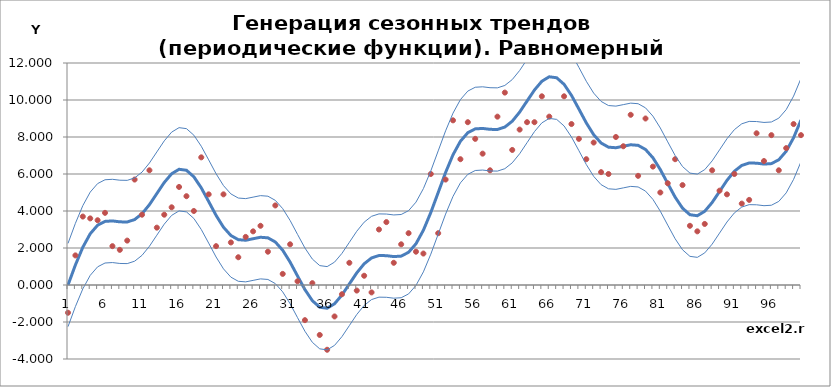
| Category | Тренд (Y) | С разбросом вокруг тренда (Y) | Нижняя граница | Верхняя граница |
|---|---|---|---|---|
| 0 | 0 | -1.5 | -2.25 | 2.25 |
| 1 | 1.083 | 1.6 | -1.167 | 3.333 |
| 2 | 2.039 | 3.7 | -0.211 | 4.289 |
| 3 | 2.771 | 3.6 | 0.521 | 5.021 |
| 4 | 3.232 | 3.5 | 0.982 | 5.482 |
| 5 | 3.439 | 3.9 | 1.189 | 5.689 |
| 6 | 3.464 | 2.1 | 1.214 | 5.714 |
| 7 | 3.414 | 1.9 | 1.164 | 5.664 |
| 8 | 3.407 | 2.4 | 1.157 | 5.657 |
| 9 | 3.537 | 5.7 | 1.287 | 5.787 |
| 10 | 3.853 | 3.8 | 1.603 | 6.103 |
| 11 | 4.345 | 6.2 | 2.095 | 6.595 |
| 12 | 4.943 | 3.1 | 2.693 | 7.193 |
| 13 | 5.541 | 3.8 | 3.291 | 7.791 |
| 14 | 6.014 | 4.2 | 3.764 | 8.264 |
| 15 | 6.255 | 5.3 | 4.005 | 8.505 |
| 16 | 6.202 | 4.8 | 3.952 | 8.452 |
| 17 | 5.848 | 4 | 3.598 | 8.098 |
| 18 | 5.25 | 6.9 | 3 | 7.5 |
| 19 | 4.513 | 4.9 | 2.263 | 6.763 |
| 20 | 3.763 | 2.1 | 1.513 | 6.013 |
| 21 | 3.122 | 4.9 | 0.872 | 5.372 |
| 22 | 2.674 | 2.3 | 0.424 | 4.924 |
| 23 | 2.45 | 1.5 | 0.2 | 4.7 |
| 24 | 2.42 | 2.6 | 0.17 | 4.67 |
| 25 | 2.5 | 2.9 | 0.25 | 4.75 |
| 26 | 2.58 | 3.2 | 0.33 | 4.83 |
| 27 | 2.55 | 1.8 | 0.3 | 4.8 |
| 28 | 2.326 | 4.3 | 0.076 | 4.576 |
| 29 | 1.878 | 0.6 | -0.372 | 4.128 |
| 30 | 1.237 | 2.2 | -1.013 | 3.487 |
| 31 | 0.487 | 0.2 | -1.763 | 2.737 |
| 32 | -0.25 | -1.9 | -2.5 | 2 |
| 33 | -0.848 | 0.1 | -3.098 | 1.402 |
| 34 | -1.202 | -2.7 | -3.452 | 1.048 |
| 35 | -1.255 | -3.5 | -3.505 | 0.995 |
| 36 | -1.014 | -1.7 | -3.264 | 1.236 |
| 37 | -0.541 | -0.5 | -2.791 | 1.709 |
| 38 | 0.057 | 1.2 | -2.193 | 2.307 |
| 39 | 0.655 | -0.3 | -1.595 | 2.905 |
| 40 | 1.147 | 0.5 | -1.103 | 3.397 |
| 41 | 1.463 | -0.4 | -0.787 | 3.713 |
| 42 | 1.593 | 3 | -0.657 | 3.843 |
| 43 | 1.586 | 3.4 | -0.664 | 3.836 |
| 44 | 1.536 | 1.2 | -0.714 | 3.786 |
| 45 | 1.561 | 2.2 | -0.689 | 3.811 |
| 46 | 1.768 | 2.8 | -0.482 | 4.018 |
| 47 | 2.229 | 1.8 | -0.021 | 4.479 |
| 48 | 2.961 | 1.7 | 0.711 | 5.211 |
| 49 | 3.917 | 6 | 1.667 | 6.167 |
| 50 | 5 | 2.8 | 2.75 | 7.25 |
| 51 | 6.083 | 5.7 | 3.833 | 8.333 |
| 52 | 7.039 | 8.9 | 4.789 | 9.289 |
| 53 | 7.771 | 6.8 | 5.521 | 10.021 |
| 54 | 8.232 | 8.8 | 5.982 | 10.482 |
| 55 | 8.439 | 7.9 | 6.189 | 10.689 |
| 56 | 8.464 | 7.1 | 6.214 | 10.714 |
| 57 | 8.414 | 6.2 | 6.164 | 10.664 |
| 58 | 8.407 | 9.1 | 6.157 | 10.657 |
| 59 | 8.537 | 10.4 | 6.287 | 10.787 |
| 60 | 8.853 | 7.3 | 6.603 | 11.103 |
| 61 | 9.345 | 8.4 | 7.095 | 11.595 |
| 62 | 9.943 | 8.8 | 7.693 | 12.193 |
| 63 | 10.541 | 8.8 | 8.291 | 12.791 |
| 64 | 11.014 | 10.2 | 8.764 | 13.264 |
| 65 | 11.255 | 9.1 | 9.005 | 13.505 |
| 66 | 11.202 | 13 | 8.952 | 13.452 |
| 67 | 10.848 | 10.2 | 8.598 | 13.098 |
| 68 | 10.25 | 8.7 | 8 | 12.5 |
| 69 | 9.513 | 7.9 | 7.263 | 11.763 |
| 70 | 8.763 | 6.8 | 6.513 | 11.013 |
| 71 | 8.122 | 7.7 | 5.872 | 10.372 |
| 72 | 7.674 | 6.1 | 5.424 | 9.924 |
| 73 | 7.45 | 6 | 5.2 | 9.7 |
| 74 | 7.42 | 8 | 5.17 | 9.67 |
| 75 | 7.5 | 7.5 | 5.25 | 9.75 |
| 76 | 7.58 | 9.2 | 5.33 | 9.83 |
| 77 | 7.55 | 5.9 | 5.3 | 9.8 |
| 78 | 7.326 | 9 | 5.076 | 9.576 |
| 79 | 6.878 | 6.4 | 4.628 | 9.128 |
| 80 | 6.237 | 5 | 3.987 | 8.487 |
| 81 | 5.487 | 5.5 | 3.237 | 7.737 |
| 82 | 4.75 | 6.8 | 2.5 | 7 |
| 83 | 4.152 | 5.4 | 1.902 | 6.402 |
| 84 | 3.798 | 3.2 | 1.548 | 6.048 |
| 85 | 3.745 | 2.9 | 1.495 | 5.995 |
| 86 | 3.986 | 3.3 | 1.736 | 6.236 |
| 87 | 4.459 | 6.2 | 2.209 | 6.709 |
| 88 | 5.057 | 5.1 | 2.807 | 7.307 |
| 89 | 5.655 | 4.9 | 3.405 | 7.905 |
| 90 | 6.147 | 6 | 3.897 | 8.397 |
| 91 | 6.463 | 4.4 | 4.213 | 8.713 |
| 92 | 6.593 | 4.6 | 4.343 | 8.843 |
| 93 | 6.586 | 8.2 | 4.336 | 8.836 |
| 94 | 6.536 | 6.7 | 4.286 | 8.786 |
| 95 | 6.561 | 8.1 | 4.311 | 8.811 |
| 96 | 6.768 | 6.2 | 4.518 | 9.018 |
| 97 | 7.229 | 7.4 | 4.979 | 9.479 |
| 98 | 7.961 | 8.7 | 5.711 | 10.211 |
| 99 | 8.917 | 8.1 | 6.667 | 11.167 |